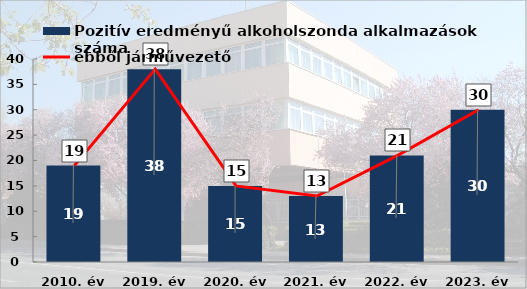
| Category | Pozitív eredményű alkoholszonda alkalmazások száma |
|---|---|
| 2010. év | 19 |
| 2019. év | 38 |
| 2020. év | 15 |
| 2021. év | 13 |
| 2022. év | 21 |
| 2023. év | 30 |